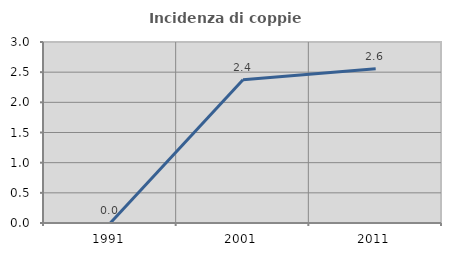
| Category | Incidenza di coppie miste |
|---|---|
| 1991.0 | 0 |
| 2001.0 | 2.374 |
| 2011.0 | 2.556 |